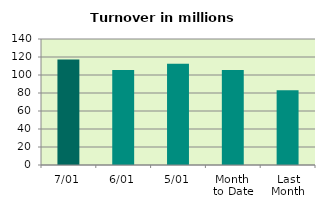
| Category | Series 0 |
|---|---|
| 7/01 | 117.093 |
| 6/01 | 105.428 |
| 5/01 | 112.413 |
| Month 
to Date | 105.584 |
| Last
Month | 83.19 |